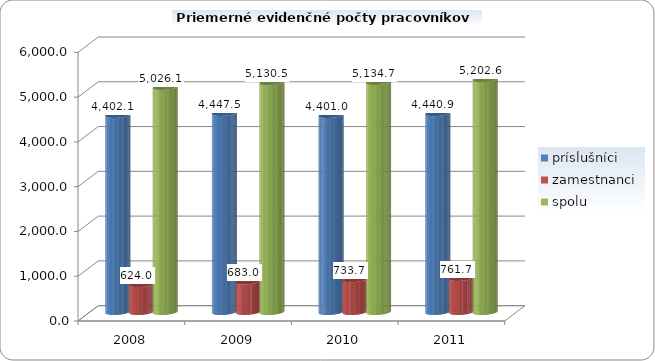
| Category | príslušníci | zamestnanci | spolu |
|---|---|---|---|
| 2008.0 | 4402.1 | 624 | 5026.1 |
| 2009.0 | 4447.5 | 683 | 5130.5 |
| 2010.0 | 4401 | 733.7 | 5134.7 |
| 2011.0 | 4440.9 | 761.7 | 5202.6 |